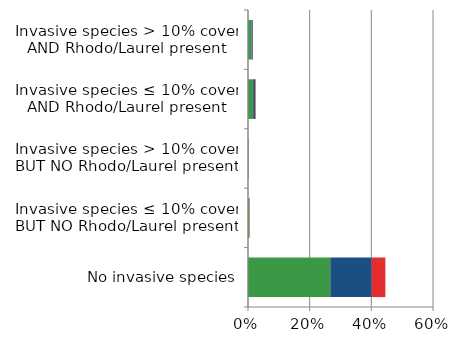
| Category | England | Scotland | Wales |
|---|---|---|---|
| No invasive species | 0.267 | 0.134 | 0.044 |
| Invasive species ≤ 10% cover BUT NO Rhodo/Laurel present | 0.003 | 0.001 | 0.001 |
| Invasive species > 10% cover BUT NO Rhodo/Laurel present | 0.001 | 0 | 0.001 |
| Invasive species ≤ 10% cover AND Rhodo/Laurel present | 0.017 | 0.006 | 0.002 |
| Invasive species > 10% cover AND Rhodo/Laurel present | 0.011 | 0.004 | 0.001 |